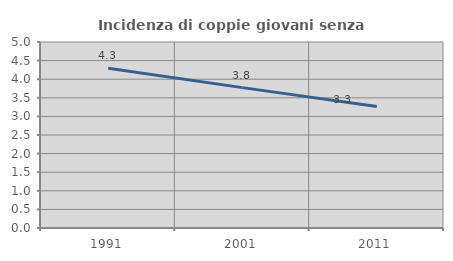
| Category | Incidenza di coppie giovani senza figli |
|---|---|
| 1991.0 | 4.291 |
| 2001.0 | 3.774 |
| 2011.0 | 3.268 |